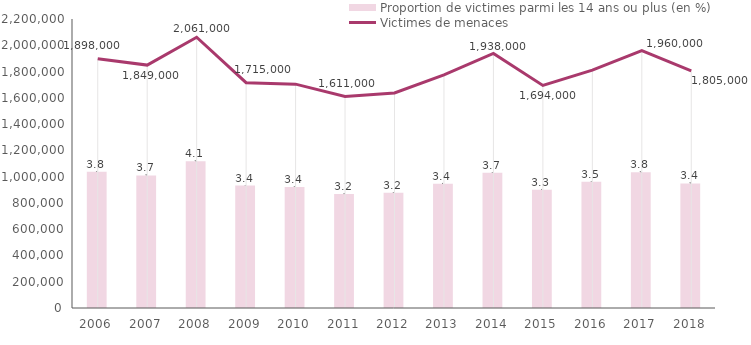
| Category | Proportion de victimes parmi les 14 ans ou plus (en %) |
|---|---|
| 2006.0 | 3.771 |
| 2007.0 | 3.67 |
| 2008.0 | 4.06 |
| 2009.0 | 3.391 |
| 2010.0 | 3.351 |
| 2011.0 | 3.153 |
| 2012.0 | 3.188 |
| 2013.0 | 3.438 |
| 2014.0 | 3.742 |
| 2015.0 | 3.272 |
| 2016.0 | 3.494 |
| 2017.0 | 3.756 |
| 2018.0 | 3.447 |